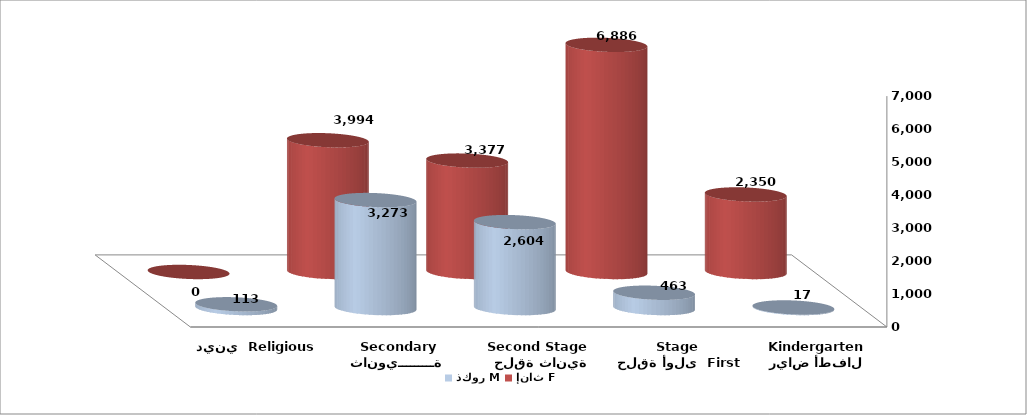
| Category | ذكور M | إناث F |
|---|---|---|
| رياض أطفال Kindergarten | 17 | 2350 |
|  حلقة أولى  First Stage | 463 | 6886 |
|   حلقة ثانية  Second Stage | 2604 | 3377 |
| ثانويـــــــــة Secondary | 3273 | 3994 |
| ديني  Religious | 113 | 0 |